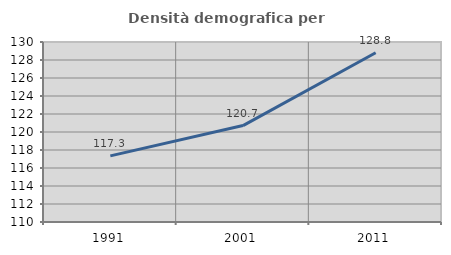
| Category | Densità demografica |
|---|---|
| 1991.0 | 117.348 |
| 2001.0 | 120.713 |
| 2011.0 | 128.812 |